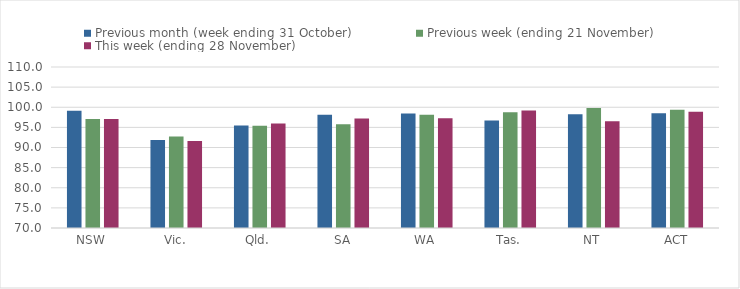
| Category | Previous month (week ending 31 October) | Previous week (ending 21 November) | This week (ending 28 November) |
|---|---|---|---|
| NSW | 99.11 | 97.1 | 97.05 |
| Vic. | 91.84 | 92.75 | 91.62 |
| Qld. | 95.47 | 95.4 | 95.95 |
| SA | 98.14 | 95.8 | 97.22 |
| WA | 98.45 | 98.15 | 97.25 |
| Tas. | 96.68 | 98.76 | 99.19 |
| NT | 98.25 | 99.79 | 96.52 |
| ACT | 98.49 | 99.37 | 98.87 |